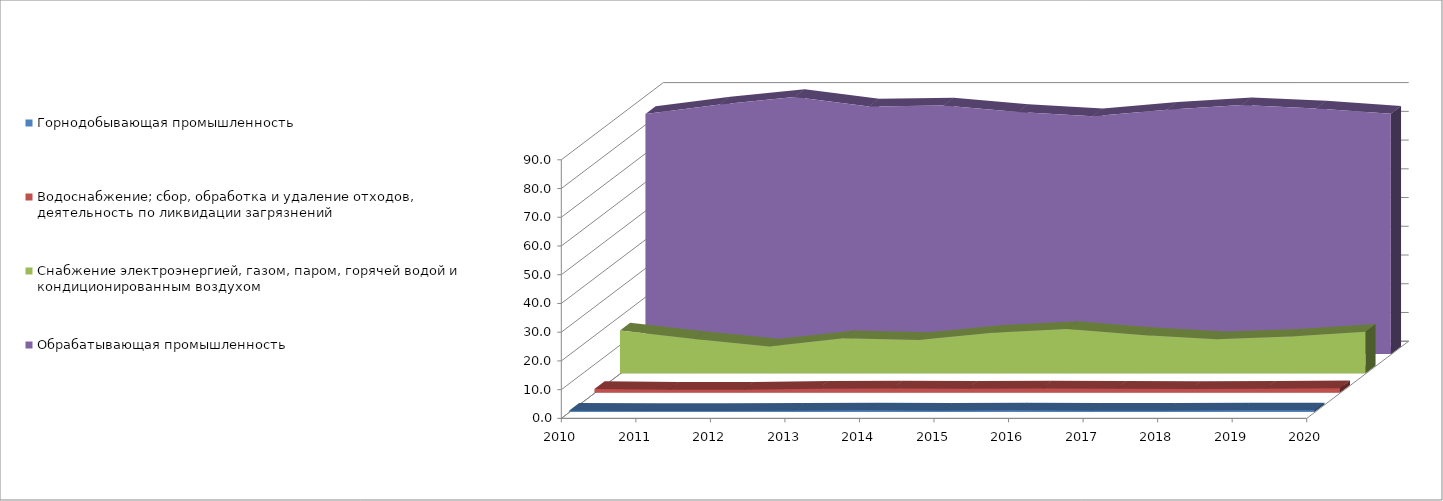
| Category | Горнодобывающая промышленность | Водоснабжение; сбор, обработка и удаление отходов, деятельность по ликвидации загрязнений | Снабжение электроэнергией, газом, паром, горячей водой и кондиционированным воздухом | Обрабатывающая промышленность |
|---|---|---|---|---|
| 2010.0 | 0.4 | 1.2 | 14.9 | 83.5 |
| 2011.0 | 0.3 | 1 | 11.9 | 86.8 |
| 2012.0 | 0.3 | 1 | 9.3 | 89.4 |
| 2013.0 | 0.4 | 1.3 | 12.2 | 86.1 |
| 2014.0 | 0.5 | 1.4 | 11.6 | 86.5 |
| 2015.0 | 0.4 | 1.3 | 14.1 | 84.2 |
| 2016.0 | 0.5 | 1.4 | 15.4 | 82.7 |
| 2017.0 | 0.4 | 1.3 | 13.3 | 85 |
| 2018.0 | 0.4 | 1.2 | 11.8 | 86.6 |
| 2019.0 | 0.5 | 1.3 | 12.8 | 85.4 |
| 2020.0 | 0.5 | 1.5 | 14.4 | 83.6 |